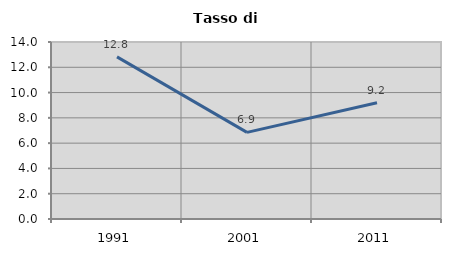
| Category | Tasso di disoccupazione   |
|---|---|
| 1991.0 | 12.824 |
| 2001.0 | 6.852 |
| 2011.0 | 9.193 |